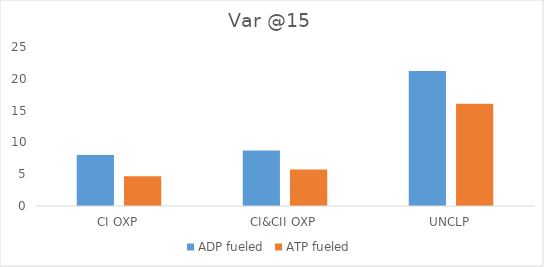
| Category | ADP fueled | ATP fueled |
|---|---|---|
| CI OXP | 8.003 | 4.692 |
| CI&CII OXP | 8.742 | 5.736 |
| UNCLP | 21.22 | 16.071 |